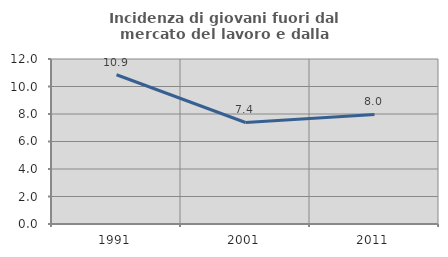
| Category | Incidenza di giovani fuori dal mercato del lavoro e dalla formazione  |
|---|---|
| 1991.0 | 10.853 |
| 2001.0 | 7.383 |
| 2011.0 | 7.971 |